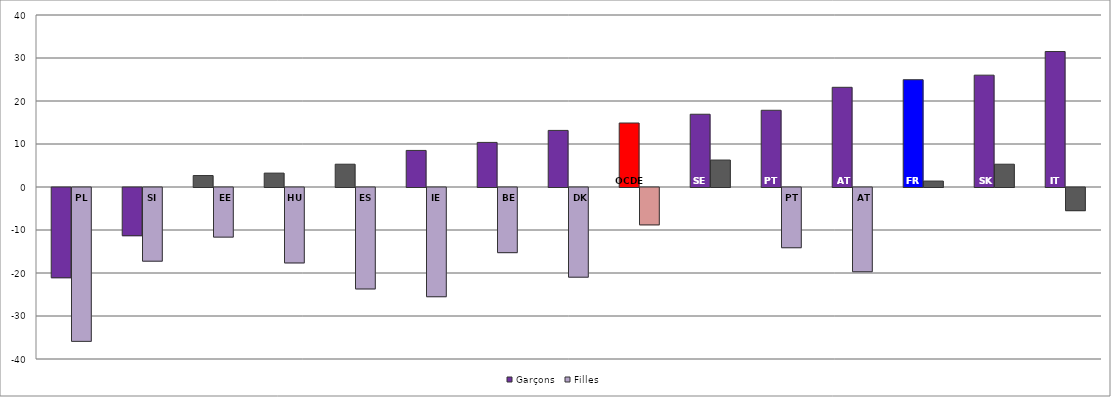
| Category | Garçons | Filles |
|---|---|---|
| PL | -20.985 | -35.784 |
| SI | -11.206 | -17.135 |
| EE | 2.664 | -11.539 |
| HU | 3.23 | -17.541 |
| ES | 5.299 | -23.592 |
| IE | 8.506 | -25.401 |
| BE | 10.37 | -15.146 |
| DK | 13.159 | -20.857 |
| OCDE | 14.882 | -8.692 |
| SE | 16.922 | 6.27 |
| PT | 17.842 | -14.005 |
| AT | 23.184 | -19.59 |
| FR | 24.951 | 1.381 |
| SK | 26.009 | 5.301 |
| IT | 31.505 | -5.385 |